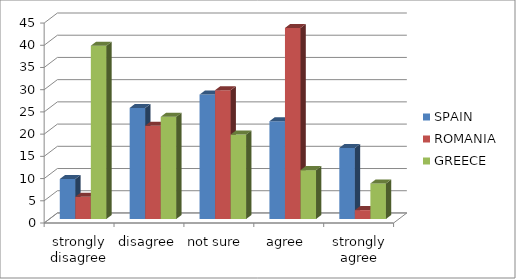
| Category | SPAIN | ROMANIA | GREECE |
|---|---|---|---|
| strongly disagree | 9 | 5 | 39 |
| disagree | 25 | 21 | 23 |
| not sure  | 28 | 29 | 19 |
| agree  | 22 | 43 | 11 |
| strongly agree | 16 | 2 | 8 |